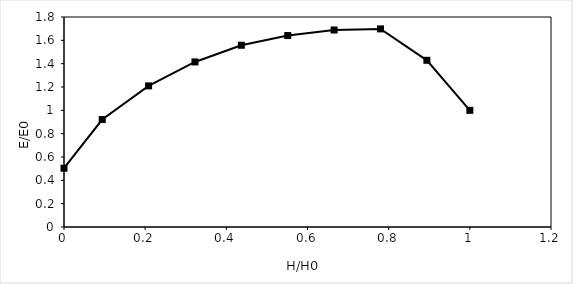
| Category | System 15 |
|---|---|
| 1.0 | 1 |
| 0.8941798941798942 | 1.429 |
| 0.7798941798941799 | 1.698 |
| 0.6656084656084655 | 1.689 |
| 0.5513227513227513 | 1.641 |
| 0.437037037037037 | 1.558 |
| 0.32275132275132273 | 1.415 |
| 0.20846560846560844 | 1.21 |
| 0.09417989417989416 | 0.921 |
| 0.0 | 0.504 |